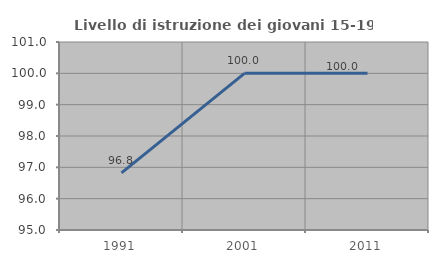
| Category | Livello di istruzione dei giovani 15-19 anni |
|---|---|
| 1991.0 | 96.825 |
| 2001.0 | 100 |
| 2011.0 | 100 |